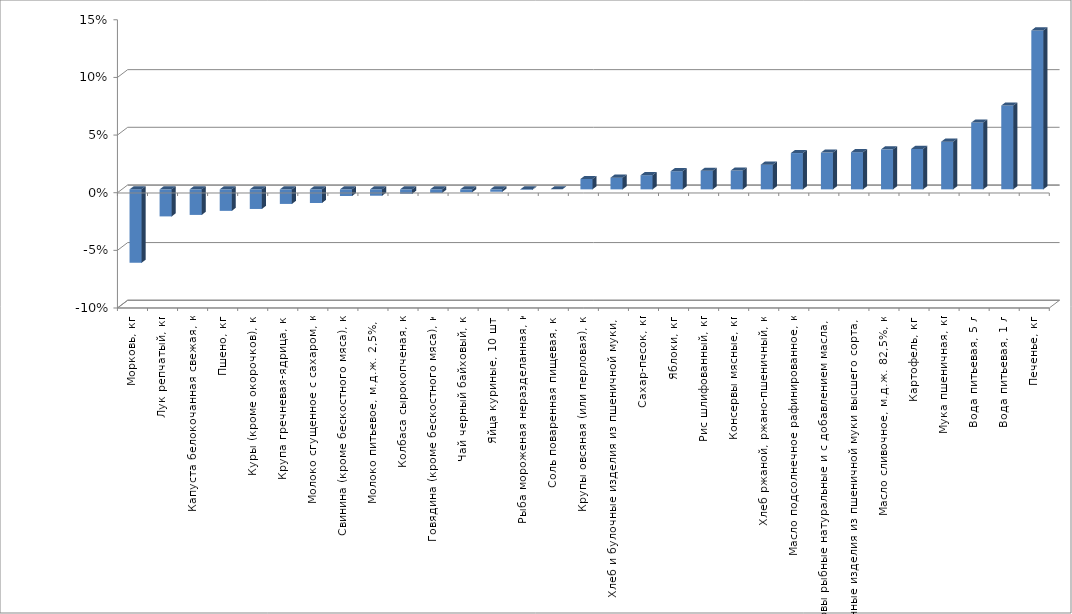
| Category | Series 0 |
|---|---|
| Морковь, кг | -0.064 |
| Лук репчатый, кг | -0.023 |
| Капуста белокочанная свежая, кг | -0.022 |
| Пшено, кг | -0.019 |
| Куры (кроме окорочков), кг | -0.017 |
| Крупа гречневая-ядрица, кг | -0.013 |
| Молоко сгущенное с сахаром, кг | -0.012 |
| Свинина (кроме бескостного мяса), кг | -0.006 |
| Молоко питьевое, м.д.ж. 2,5%, л | -0.006 |
| Колбаса сырокопченая, кг | -0.004 |
| Говядина (кроме бескостного мяса), кг | -0.003 |
| Чай черный байховый, кг | -0.002 |
| Яйца куриные, 10 шт. | -0.002 |
| Рыба мороженая неразделанная, кг | 0 |
| Соль поваренная пищевая, кг | 0 |
| Крупы овсяная (или перловая), кг | 0.009 |
| Хлеб и булочные изделия из пшеничной муки, кг | 0.01 |
| Сахар-песок, кг | 0.012 |
| Яблоки, кг | 0.016 |
| Рис шлифованный, кг | 0.016 |
| Консервы мясные, кг | 0.016 |
| Хлеб ржаной, ржано-пшеничный, кг | 0.021 |
| Масло подсолнечное рафинированное, кг | 0.031 |
| Консервы рыбные натуральные и с добавлением масла, кг | 0.032 |
| Макаронные изделия из пшеничной муки высшего сорта, кг | 0.032 |
| Масло сливочное, м.д.ж. 82,5%, кг | 0.035 |
| Картофель, кг | 0.035 |
| Мука пшеничная, кг | 0.041 |
| Вода питьевая, 5 л | 0.058 |
| Вода питьевая, 1 л | 0.073 |
| Печенье, кг | 0.138 |